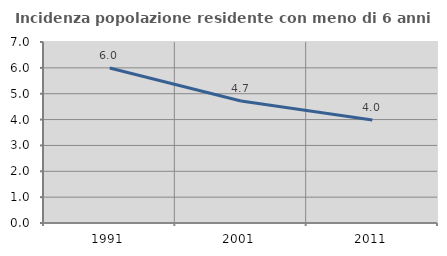
| Category | Incidenza popolazione residente con meno di 6 anni |
|---|---|
| 1991.0 | 5.995 |
| 2001.0 | 4.718 |
| 2011.0 | 3.982 |